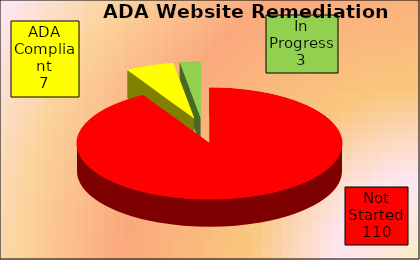
| Category | TOTAL |
|---|---|
| 0 | 110 |
| 1 | 7 |
| 2 | 3 |